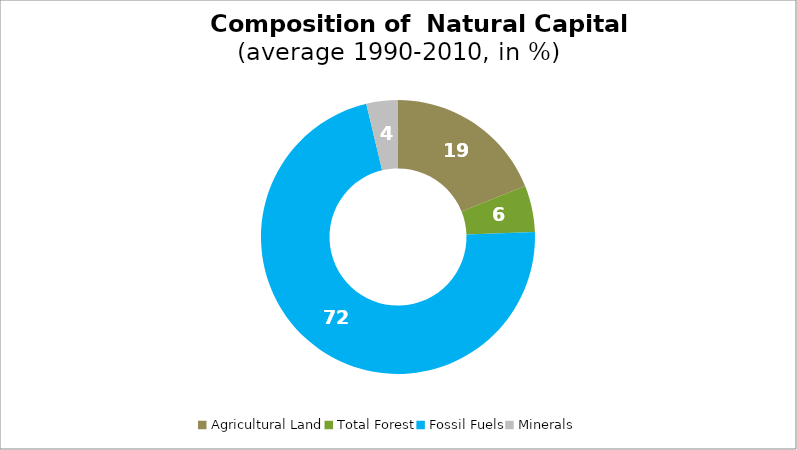
| Category | Series 0 |
|---|---|
| Agricultural Land | 18.918 |
| Total Forest | 5.514 |
| Fossil Fuels | 71.847 |
| Minerals | 3.721 |